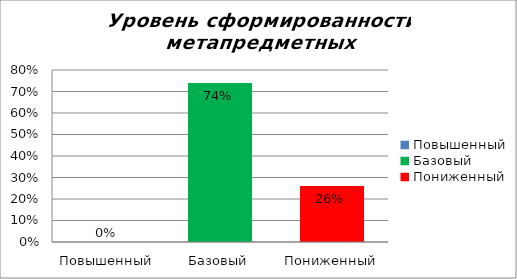
| Category | Уровень сформированности метапредметных результатов |
|---|---|
| Повышенный | 0 |
| Базовый | 0.74 |
| Пониженный | 0.26 |